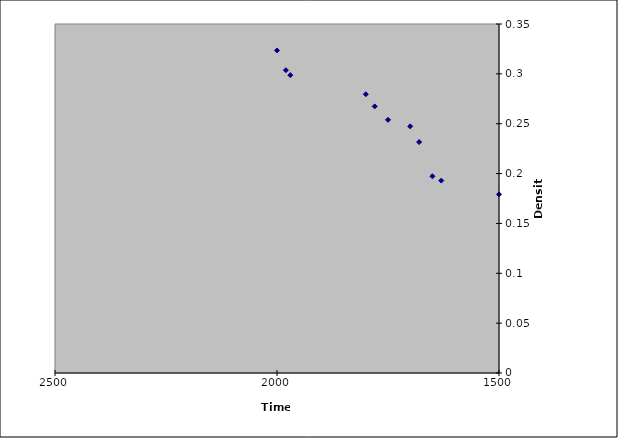
| Category | Series 0 |
|---|---|
| 1970.0 | 0.299 |
| 1980.0 | 0.304 |
| 1680.0 | 0.232 |
| 1780.0 | 0.267 |
| 1800.0 | 0.28 |
| 1750.0 | 0.254 |
| 1650.0 | 0.197 |
| 1630.0 | 0.193 |
| 1700.0 | 0.247 |
| 1500.0 | 0.179 |
| 2000.0 | 0.323 |